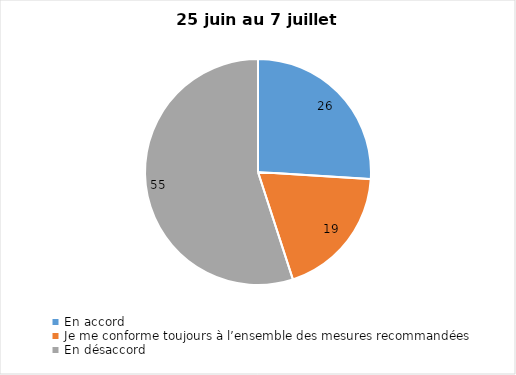
| Category | Series 0 |
|---|---|
| En accord | 26 |
| Je me conforme toujours à l’ensemble des mesures recommandées | 19 |
| En désaccord | 55 |